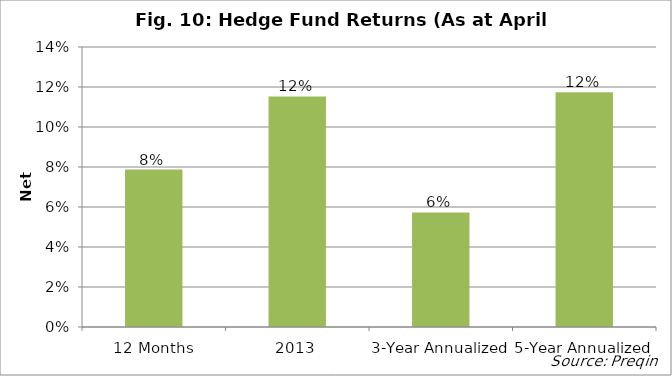
| Category | Net Return  |
|---|---|
| 12 Months | 0.079 |
| 2013 | 0.115 |
| 3-Year Annualized | 0.057 |
| 5-Year Annualized | 0.117 |